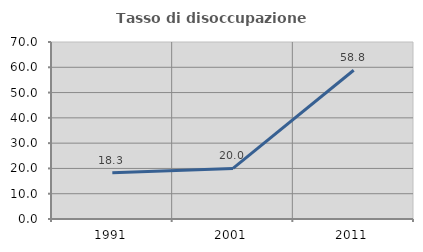
| Category | Tasso di disoccupazione giovanile  |
|---|---|
| 1991.0 | 18.333 |
| 2001.0 | 20 |
| 2011.0 | 58.824 |